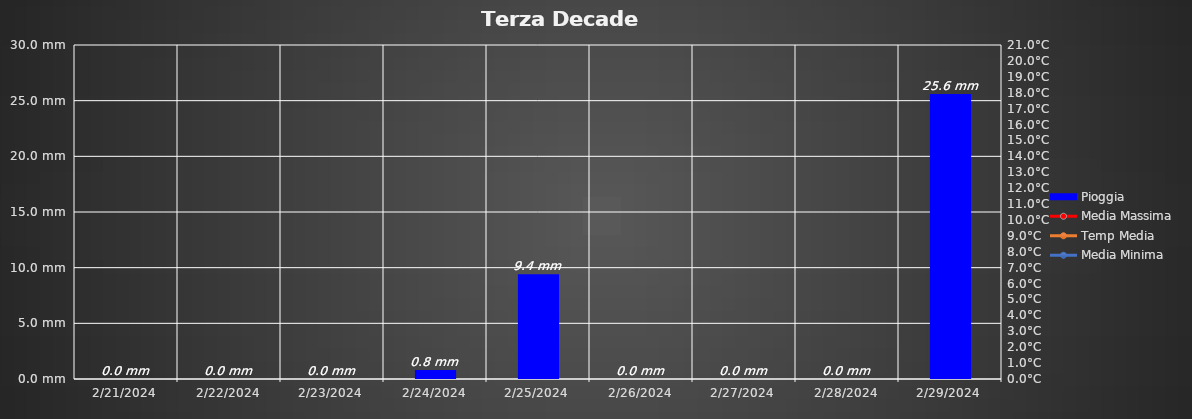
| Category | Pioggia |
|---|---|
| 2/21/24 | 0 |
| 2/22/24 | 0 |
| 2/23/24 | 0 |
| 2/24/24 | 0.8 |
| 2/25/24 | 1900-01-09 09:36:00 |
| 2/26/24 | 0 |
| 2/27/24 | 0 |
| 2/28/24 | 0 |
| 2/29/24 | 1900-01-25 14:24:00 |